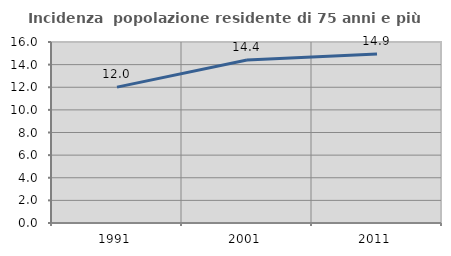
| Category | Incidenza  popolazione residente di 75 anni e più |
|---|---|
| 1991.0 | 12.012 |
| 2001.0 | 14.407 |
| 2011.0 | 14.949 |